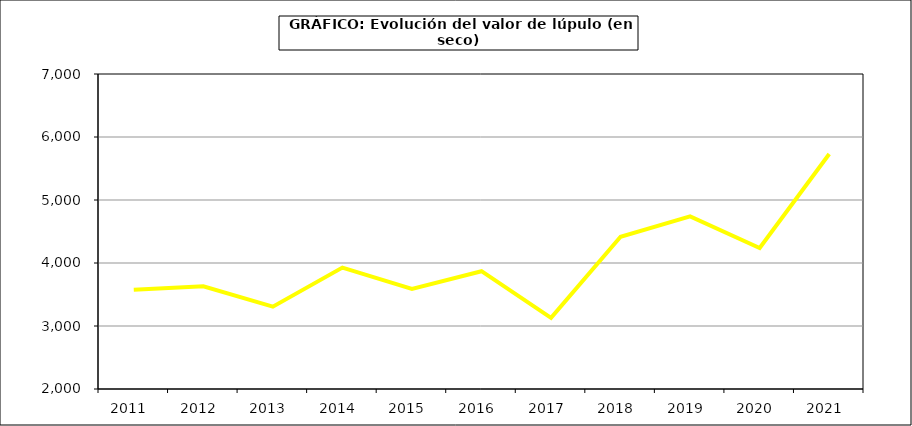
| Category | Valor |
|---|---|
| 2011.0 | 3575.44 |
| 2012.0 | 3629.5 |
| 2013.0 | 3307.08 |
| 2014.0 | 3927.8 |
| 2015.0 | 3588 |
| 2016.0 | 3870 |
| 2017.0 | 3128.4 |
| 2018.0 | 4415.79 |
| 2019.0 | 4739.944 |
| 2020.0 | 4238.936 |
| 2021.0 | 5729.598 |